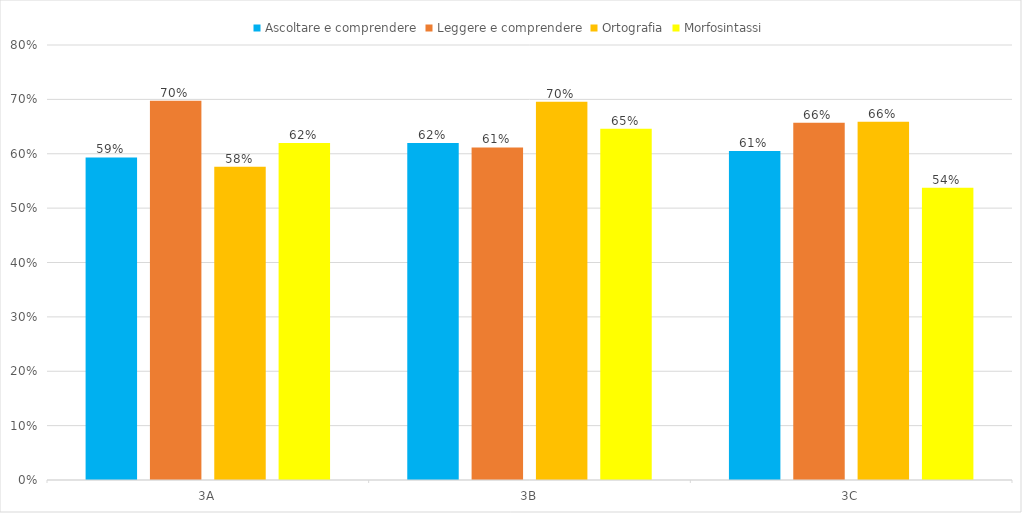
| Category | Ascoltare e comprendere | Leggere e comprendere | Ortografia | Morfosintassi |
|---|---|---|---|---|
| 3A | 0.593 | 0.698 | 0.576 | 0.62 |
| 3B | 0.62 | 0.612 | 0.696 | 0.646 |
| 3C | 0.605 | 0.657 | 0.659 | 0.538 |